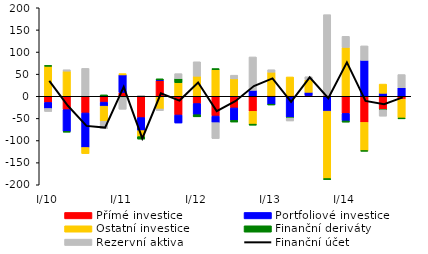
| Category | Přímé investice | Portfoliové investice | Ostatní investice | Finanční deriváty | Rezervní aktiva |
|---|---|---|---|---|---|
| I/10 | -13.934 | -13.635 | 67.89 | 1.747 | -6.812 |
| II | -30.165 | -49.571 | 56.854 | -1.202 | 3.148 |
| III | -37.641 | -78.052 | -13.851 | 1.002 | 62.09 |
| IV | -13.25 | -9.095 | -34.061 | 3.2 | -17.001 |
| I/11 | 8.394 | 39.909 | 2.964 | -2.567 | -26.789 |
| II | -48.128 | -29.388 | -13.604 | -5.635 | 2.123 |
| III | 35.202 | 1.853 | -28.649 | 2.491 | -3.698 |
| IV | -42.273 | -18.154 | 30.668 | 9.385 | 11.134 |
| I/12 | -16.29 | -25.293 | 45.36 | -4.87 | 32.632 |
| II | -44.641 | -14.957 | 60.168 | 2.453 | -35.982 |
| III | -26.334 | -28.062 | 39.368 | -3.806 | 8.321 |
| IV | -33.997 | 13.465 | -28.955 | -2.395 | 75.502 |
| I/13 | 1.859 | -18.95 | 52.574 | -0.086 | 5.61 |
| II | 1.859 | -47.44 | 41.851 | -1.44 | -6.912 |
| III | 1.859 | 7.148 | 28.263 | -1.061 | 6.889 |
| IV | 1.859 | -33.596 | -152.434 | -2.15 | 182.604 |
| I/14 | -38.685 | -16.995 | 110.469 | -2.764 | 25.08 |
| II | -59.028 | 81.147 | -64.302 | -0.503 | 32.776 |
| III | -29.662 | 6.715 | 20.861 | -0.818 | -14.448 |
| IV | -6.258 | 19.403 | -42.777 | -1.962 | 29.714 |